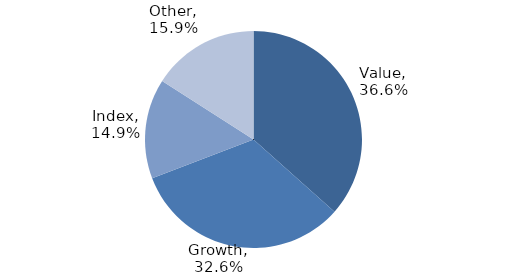
| Category | Investment Style |
|---|---|
| Value | 0.366 |
| Growth | 0.326 |
| Index | 0.149 |
| Other | 0.159 |